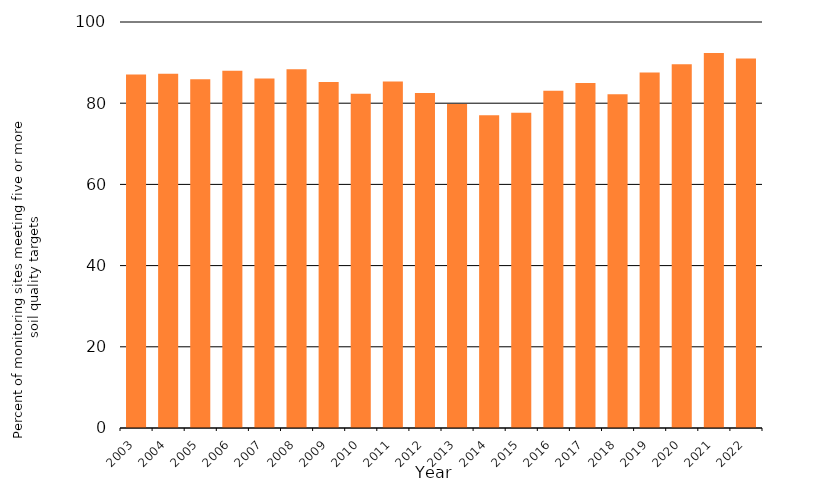
| Category | Percentage of monitoring sites meeting five or more soil quality targets |
|---|---|
| 2003.0 | 87.06 |
| 2004.0 | 87.232 |
| 2005.0 | 85.883 |
| 2006.0 | 88.015 |
| 2007.0 | 86.109 |
| 2008.0 | 88.354 |
| 2009.0 | 85.193 |
| 2010.0 | 82.305 |
| 2011.0 | 85.365 |
| 2012.0 | 82.487 |
| 2013.0 | 79.792 |
| 2014.0 | 77.06 |
| 2015.0 | 77.618 |
| 2016.0 | 83.058 |
| 2017.0 | 84.99 |
| 2018.0 | 82.188 |
| 2019.0 | 87.554 |
| 2020.0 | 89.573 |
| 2021.0 | 92.342 |
| 2022.0 | 91 |